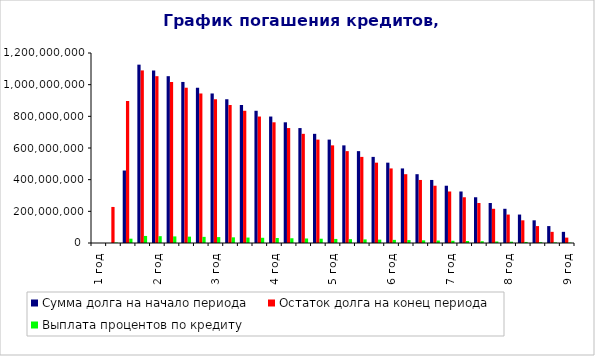
| Category | Сумма долга на начало периода | Остаток долга на конец периода | Выплата процентов по кредиту |
|---|---|---|---|
| 1 год | 0 | 0 | 0 |
|  | 0 | 227703125 | 3068000 |
|  | 457803125 | 896329792.133 | 27292080.263 |
|  | 1126429792.133 | 1090016028.677 | 44571674.839 |
| 2 год | 1090016028.677 | 1053602265.221 | 43115124.301 |
|  | 1053602265.221 | 1017188501.766 | 41658573.763 |
|  | 1017188501.766 | 980774738.31 | 40202023.225 |
|  | 980774738.31 | 944360974.854 | 38745472.686 |
| 3 год | 944360974.854 | 907947211.398 | 37288922.148 |
|  | 907947211.398 | 871533447.942 | 35832371.61 |
|  | 871533447.942 | 835119684.486 | 34375821.072 |
|  | 835119684.486 | 798705921.03 | 32919270.533 |
| 4 год | 798705921.03 | 762292157.574 | 31462719.995 |
|  | 762292157.574 | 725878394.118 | 30006169.457 |
|  | 725878394.118 | 689464630.662 | 28549618.919 |
|  | 689464630.662 | 653050867.206 | 27093068.38 |
| 5 год | 653050867.206 | 616637103.75 | 25636517.842 |
|  | 616637103.75 | 580223340.295 | 24179967.304 |
|  | 580223340.295 | 543809576.839 | 22723416.766 |
|  | 543809576.839 | 507395813.383 | 21266866.227 |
| 6 год | 507395813.383 | 470982049.927 | 19810315.689 |
|  | 470982049.927 | 434568286.471 | 18353765.151 |
|  | 434568286.471 | 398154523.015 | 16897214.613 |
|  | 398154523.015 | 361740759.559 | 15440664.075 |
| 7 год | 361740759.559 | 325326996.103 | 13984113.536 |
|  | 325326996.103 | 288913232.647 | 12527562.998 |
|  | 288913232.647 | 252499469.191 | 11071012.46 |
|  | 252499469.191 | 216085705.735 | 9614461.922 |
| 8 год | 216085705.735 | 179671942.28 | 8157911.383 |
|  | 179671942.28 | 143258178.824 | 6701360.845 |
|  | 143258178.824 | 106844415.368 | 5244810.307 |
|  | 106844415.368 | 70430651.912 | 3788259.769 |
| 9 год | 70430651.912 | 34016888.456 | 2331709.23 |